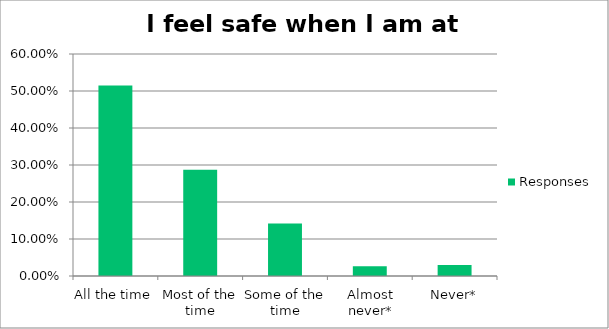
| Category | Responses |
|---|---|
| All the time | 0.515 |
| Most of the time | 0.287 |
| Some of the time | 0.142 |
| Almost never* | 0.026 |
| Never* | 0.03 |